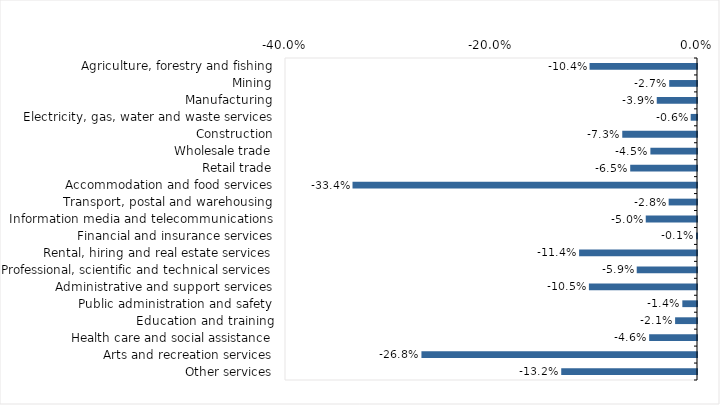
| Category | This week |
|---|---|
| Agriculture, forestry and fishing | -0.104 |
| Mining | -0.027 |
| Manufacturing | -0.039 |
| Electricity, gas, water and waste services | -0.006 |
| Construction | -0.073 |
| Wholesale trade | -0.045 |
| Retail trade | -0.065 |
| Accommodation and food services | -0.334 |
| Transport, postal and warehousing | -0.028 |
| Information media and telecommunications | -0.05 |
| Financial and insurance services | -0.001 |
| Rental, hiring and real estate services | -0.114 |
| Professional, scientific and technical services | -0.059 |
| Administrative and support services | -0.105 |
| Public administration and safety | -0.014 |
| Education and training | -0.021 |
| Health care and social assistance | -0.046 |
| Arts and recreation services | -0.268 |
| Other services | -0.132 |